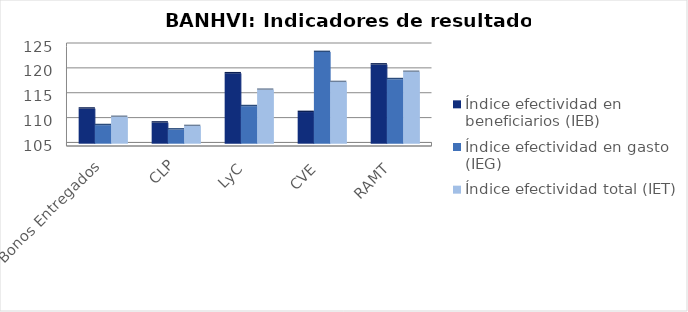
| Category | Índice efectividad en beneficiarios (IEB) | Índice efectividad en gasto (IEG)  | Índice efectividad total (IET) |
|---|---|---|---|
| Total Bonos Entregados | 112.052 | 108.73 | 110.391 |
| CLP | 109.248 | 107.858 | 108.553 |
| LyC | 119.144 | 112.545 | 115.845 |
| CVE | 111.367 | 123.433 | 117.4 |
| RAMT | 120.923 | 117.97 | 119.446 |